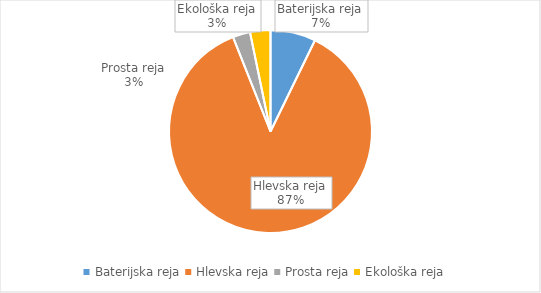
| Category | Količina kosov jajc |
|---|---|
| Baterijska reja | 278645 |
| Hlevska reja | 3347475 |
| Prosta reja | 107175 |
| Ekološka reja | 125060 |